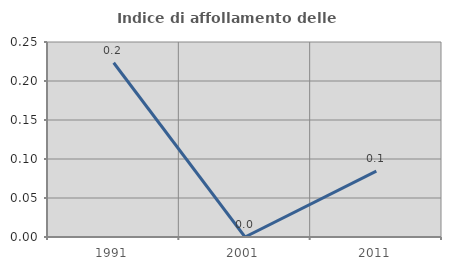
| Category | Indice di affollamento delle abitazioni  |
|---|---|
| 1991.0 | 0.223 |
| 2001.0 | 0 |
| 2011.0 | 0.084 |